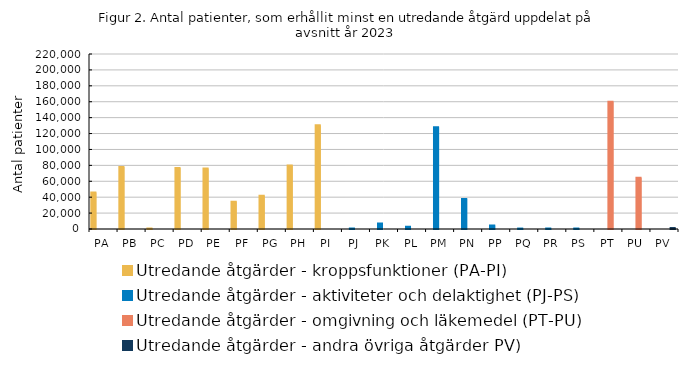
| Category | Utredande åtgärder - kroppsfunktioner (PA-PI) | Utredande åtgärder - aktiviteter och delaktighet (PJ-PS) | Utredande åtgärder - omgivning och läkemedel (PT-PU) | Utredande åtgärder - andra övriga åtgärder PV) |
|---|---|---|---|---|
| PA | 45932 | 0 | 0 | 0 |
| PB | 77903 | 0 | 0 | 0 |
| PC | 634 | 0 | 0 | 0 |
| PD | 76686 | 0 | 0 | 0 |
| PE | 76117 | 0 | 0 | 0 |
| PF | 34381 | 0 | 0 | 0 |
| PG | 41721 | 0 | 0 | 0 |
| PH | 79708 | 0 | 0 | 0 |
| PI | 130321 | 0 | 0 | 0 |
| PJ | 0 | 627 | 0 | 0 |
| PK | 0 | 6801 | 0 | 0 |
| PL | 0 | 2795 | 0 | 0 |
| PM | 0 | 127933 | 0 | 0 |
| PN | 0 | 37807 | 0 | 0 |
| PP | 0 | 4495 | 0 | 0 |
| PQ | 0 | 558 | 0 | 0 |
| PR | 0 | 626 | 0 | 0 |
| PS | 0 | 615 | 0 | 0 |
| PT | 0 | 0 | 160025 | 0 |
| PU | 0 | 0 | 64429 | 0 |
| PV | 0 | 0 | 0 | 1202 |